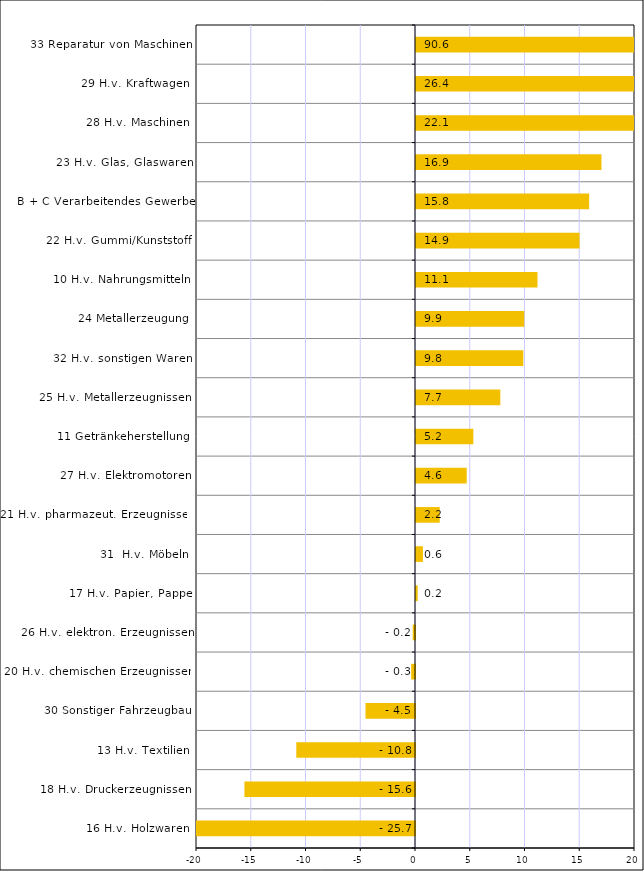
| Category | Series 0 |
|---|---|
| 16 H.v. Holzwaren | -25.731 |
| 18 H.v. Druckerzeugnissen | -15.58 |
| 13 H.v. Textilien | -10.84 |
| 30 Sonstiger Fahrzeugbau | -4.52 |
| 20 H.v. chemischen Erzeugnissen | -0.349 |
| 26 H.v. elektron. Erzeugnissen | -0.212 |
| 17 H.v. Papier, Pappe | 0.155 |
| 31  H.v. Möbeln | 0.632 |
| 21 H.v. pharmazeut. Erzeugnissen | 2.165 |
| 27 H.v. Elektromotoren | 4.631 |
| 11 Getränkeherstellung | 5.238 |
| 25 H.v. Metallerzeugnissen | 7.699 |
| 32 H.v. sonstigen Waren | 9.802 |
| 24 Metallerzeugung | 9.887 |
| 10 H.v. Nahrungsmitteln | 11.094 |
| 22 H.v. Gummi/Kunststoff | 14.935 |
| B + C Verarbeitendes Gewerbe | 15.812 |
| 23 H.v. Glas, Glaswaren | 16.936 |
| 28 H.v. Maschinen | 22.106 |
| 29 H.v. Kraftwagen | 26.388 |
| 33 Reparatur von Maschinen | 90.553 |